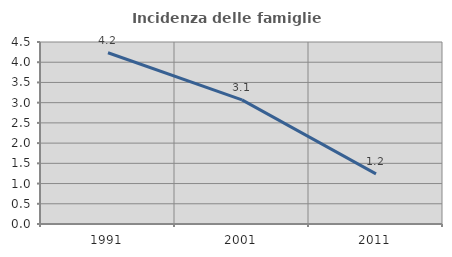
| Category | Incidenza delle famiglie numerose |
|---|---|
| 1991.0 | 4.234 |
| 2001.0 | 3.067 |
| 2011.0 | 1.239 |